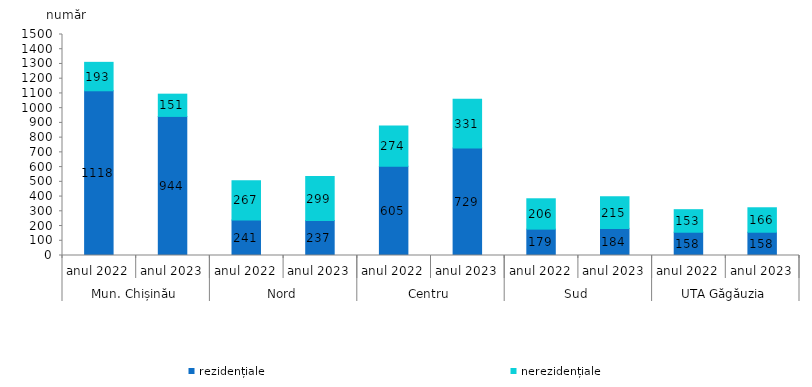
| Category | rezidențiale | nerezidențiale |
|---|---|---|
| 0 | 1118 | 193 |
| 1 | 944 | 151 |
| 2 | 241 | 267 |
| 3 | 237 | 299 |
| 4 | 605 | 274 |
| 5 | 729 | 331 |
| 6 | 179 | 206 |
| 7 | 184 | 215 |
| 8 | 158 | 153 |
| 9 | 158 | 166 |